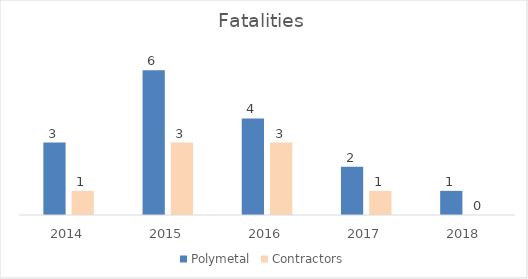
| Category | Polymetal | Contractors |
|---|---|---|
| 2014.0 | 3 | 1 |
| 2015.0 | 6 | 3 |
| 2016.0 | 4 | 3 |
| 2017.0 | 2 | 1 |
| 2018.0 | 1 | 0 |